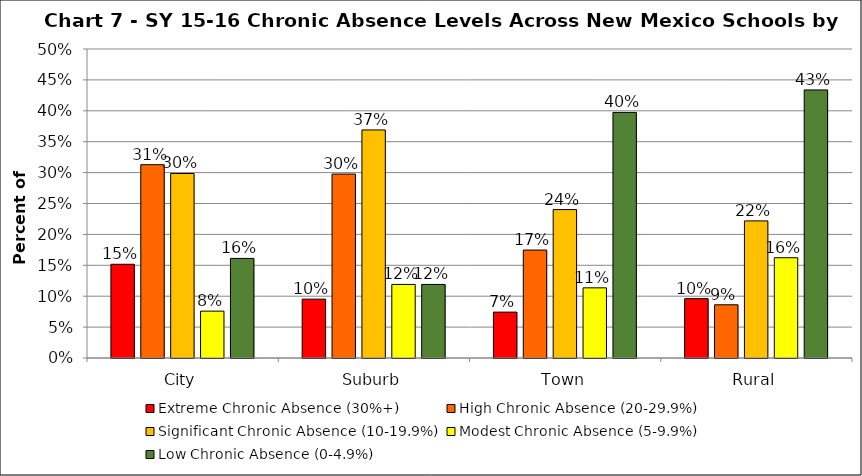
| Category | Extreme Chronic Absence (30%+) | High Chronic Absence (20-29.9%) | Significant Chronic Absence (10-19.9%) | Modest Chronic Absence (5-9.9%) | Low Chronic Absence (0-4.9%) |
|---|---|---|---|---|---|
| 0 | 0.152 | 0.313 | 0.299 | 0.076 | 0.161 |
| 1 | 0.095 | 0.298 | 0.369 | 0.119 | 0.119 |
| 2 | 0.074 | 0.175 | 0.24 | 0.114 | 0.397 |
| 3 | 0.096 | 0.086 | 0.222 | 0.162 | 0.434 |